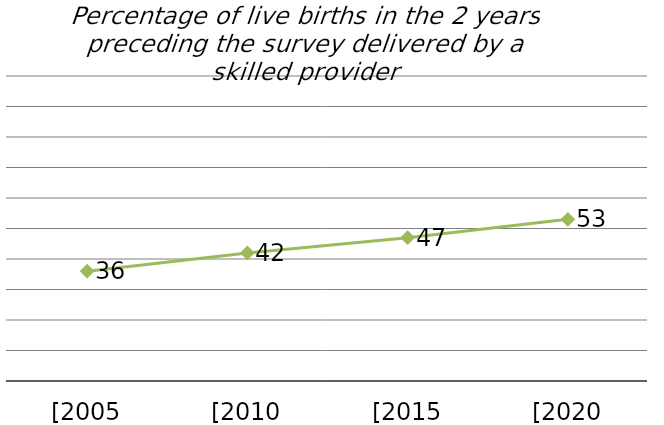
| Category | Skilled provider |
|---|---|
| [2005 xDHS] | 36 |
| [2010 xDHS] | 42 |
| [2015 xDHS] | 47 |
| [2020 xDHS] | 53 |